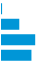
| Category | Series 0 |
|---|---|
| 0 | 0.001 |
| 1 | 0.216 |
| 2 | 0.415 |
| 3 | 0.368 |